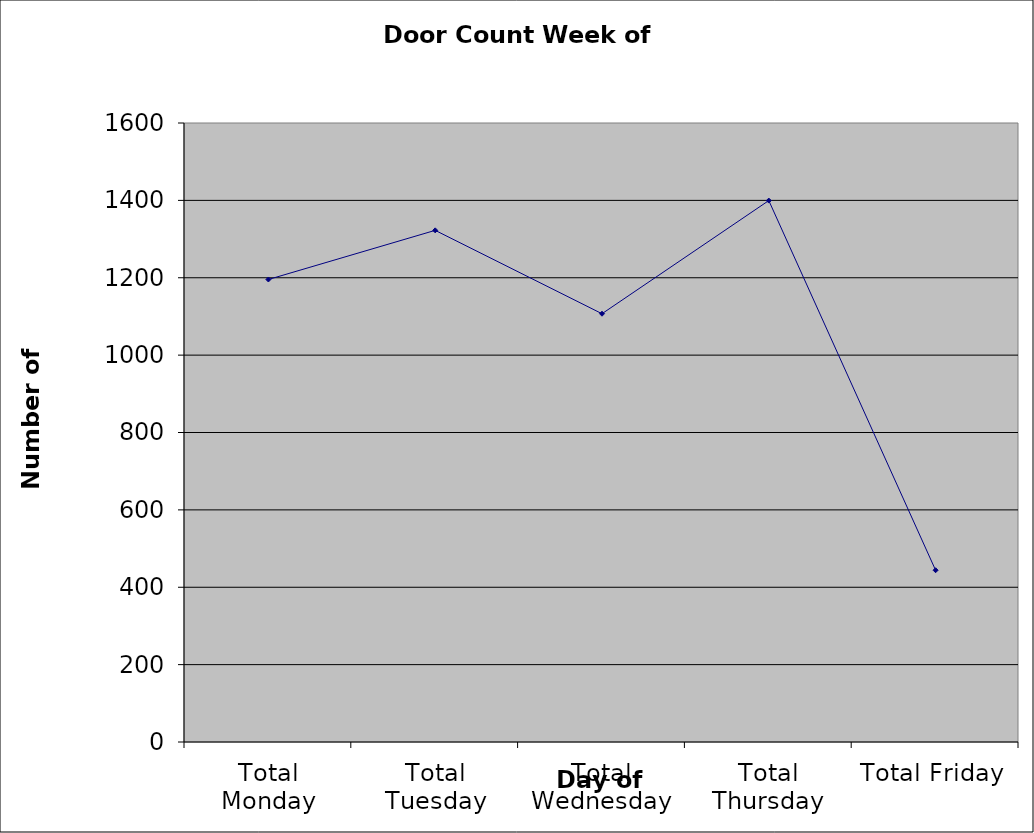
| Category | Series 0 |
|---|---|
| Total Monday | 1195.5 |
| Total Tuesday | 1322.5 |
| Total Wednesday | 1107 |
| Total Thursday | 1399.5 |
| Total Friday | 444 |